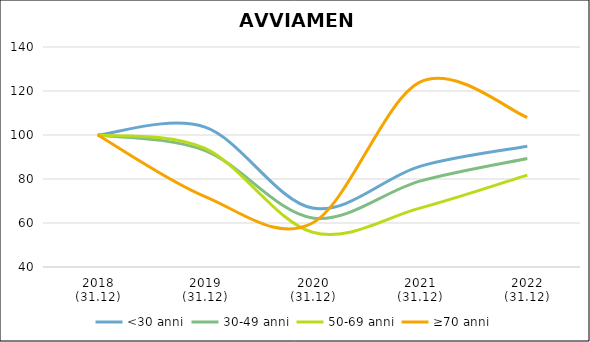
| Category | <30 anni | 30-49 anni | 50-69 anni | ≥70 anni |
|---|---|---|---|---|
| 2018
(31.12) | 100 | 100 | 100 | 100 |
| 2019
(31.12) | 103.551 | 92.912 | 93.872 | 72 |
| 2020
(31.12) | 66.792 | 62.284 | 55.785 | 60 |
| 2021
(31.12) | 85.746 | 79.042 | 66.781 | 124 |
| 2022
(31.12) | 94.871 | 89.346 | 81.787 | 108 |